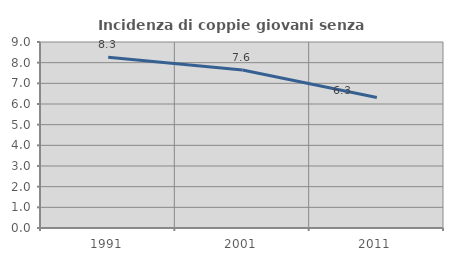
| Category | Incidenza di coppie giovani senza figli |
|---|---|
| 1991.0 | 8.264 |
| 2001.0 | 7.648 |
| 2011.0 | 6.312 |